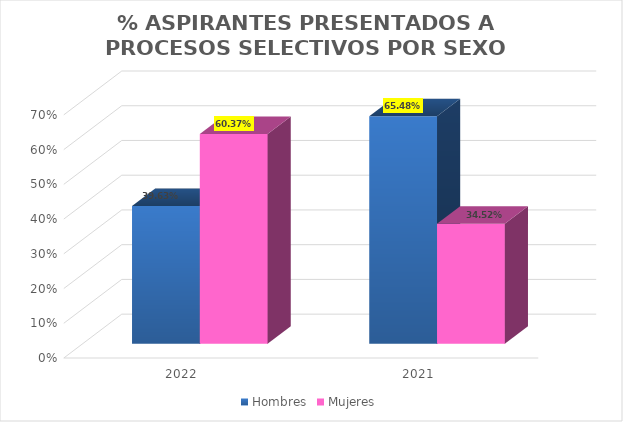
| Category | Hombres | Mujeres |
|---|---|---|
| 2022.0 | 0.396 | 0.604 |
| 2021.0 | 0.655 | 0.345 |